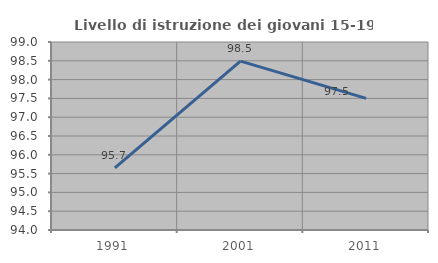
| Category | Livello di istruzione dei giovani 15-19 anni |
|---|---|
| 1991.0 | 95.652 |
| 2001.0 | 98.492 |
| 2011.0 | 97.5 |